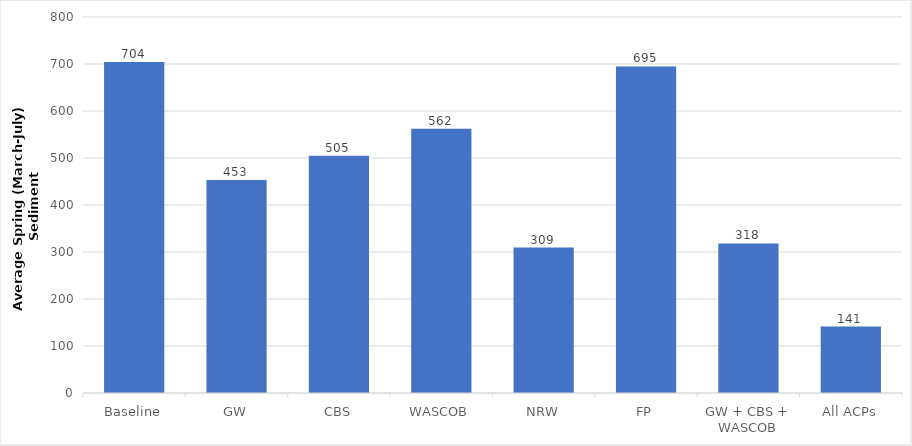
| Category | Average Spring Sediment Load (metric tons) |
|---|---|
| Baseline | 704.213 |
| GW | 453.338 |
| CBS | 504.784 |
| WASCOB | 562.091 |
| NRW | 309.393 |
| FP | 694.802 |
| GW + CBS + WASCOB | 318.217 |
| All ACPs | 141.248 |